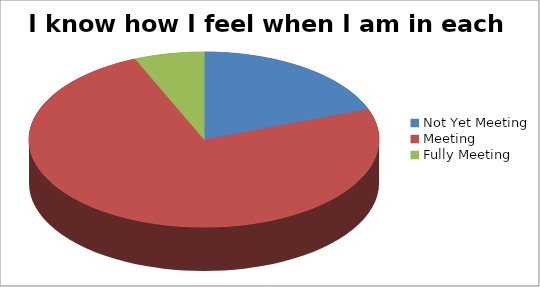
| Category | I know how I feel when I am in each zone |
|---|---|
| Not Yet Meeting | 6 |
| Meeting | 23 |
| Fully Meeting | 2 |